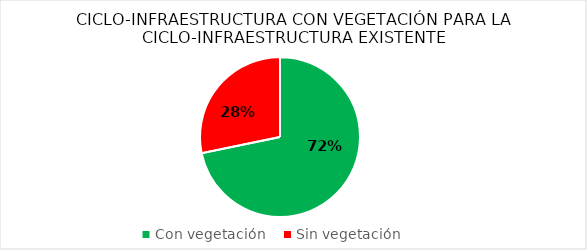
| Category | Series 0 |
|---|---|
| Con vegetación  | 71.763 |
| Sin vegetación | 28.237 |